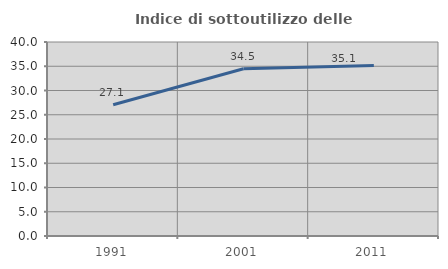
| Category | Indice di sottoutilizzo delle abitazioni  |
|---|---|
| 1991.0 | 27.07 |
| 2001.0 | 34.487 |
| 2011.0 | 35.132 |